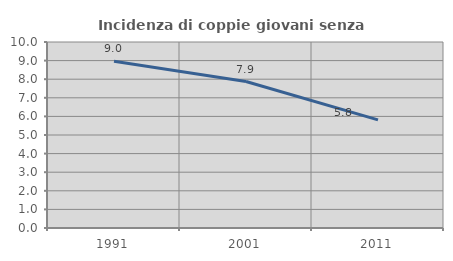
| Category | Incidenza di coppie giovani senza figli |
|---|---|
| 1991.0 | 8.964 |
| 2001.0 | 7.875 |
| 2011.0 | 5.814 |